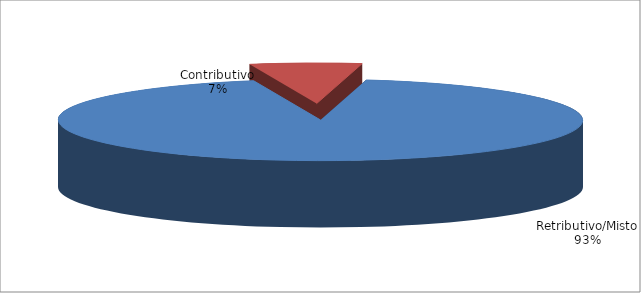
| Category | Series 1 |
|---|---|
| Retributivo/Misto | 159747 |
| Contributivo | 11804 |